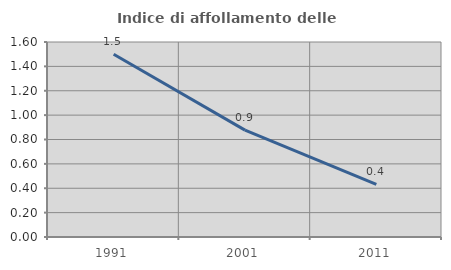
| Category | Indice di affollamento delle abitazioni  |
|---|---|
| 1991.0 | 1.5 |
| 2001.0 | 0.877 |
| 2011.0 | 0.431 |